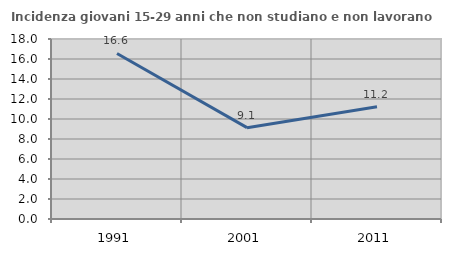
| Category | Incidenza giovani 15-29 anni che non studiano e non lavorano  |
|---|---|
| 1991.0 | 16.555 |
| 2001.0 | 9.134 |
| 2011.0 | 11.233 |